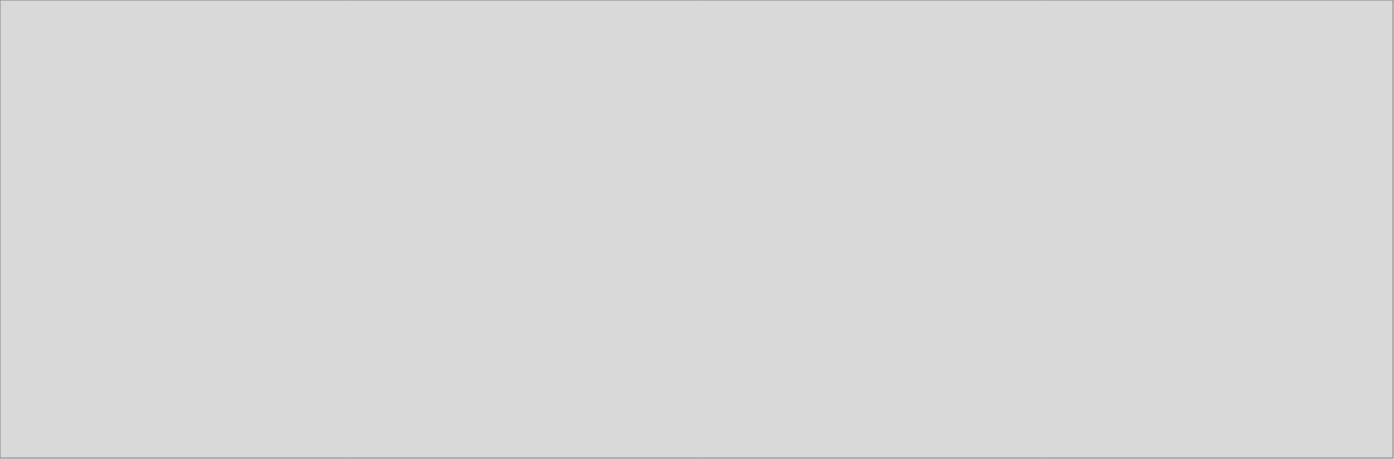
| Category | Alquiler de vivienda  |
|---|---|
| 2018_I | 9831 |
| 2018_II | 9879.885 |
| 2018_III | 9982.699 |
| 2018_IV | 10070.466 |
| 2019_I | 10199.395 |
| 2019_II | 10230.631 |
| 2019_III | 0 |
| 2019_IV | 0 |